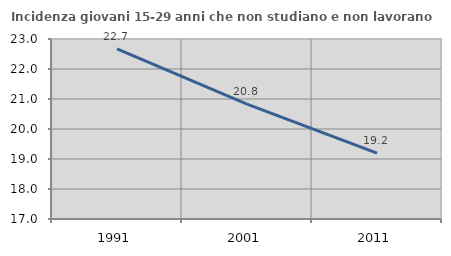
| Category | Incidenza giovani 15-29 anni che non studiano e non lavorano  |
|---|---|
| 1991.0 | 22.67 |
| 2001.0 | 20.832 |
| 2011.0 | 19.198 |